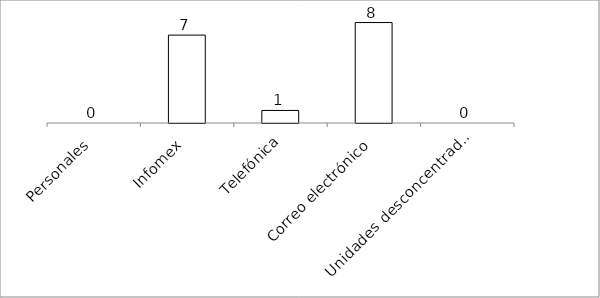
| Category | Series 0 |
|---|---|
| Personales | 0 |
| Infomex | 7 |
| Telefónica | 1 |
| Correo electrónico | 8 |
| Unidades desconcentradas | 0 |